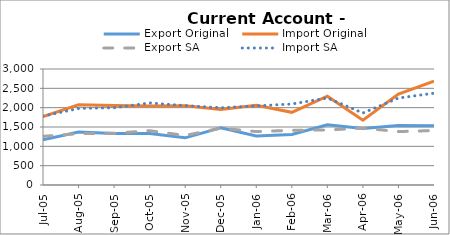
| Category | Export Original | Import Original | Export SA | Import SA |
|---|---|---|---|---|
| 2005-07-31 | 1171 | 1767 | 1259 | 1781 |
| 2005-08-31 | 1368 | 2074 | 1327 | 1980 |
| 2005-09-30 | 1331 | 2058 | 1338 | 1998 |
| 2005-10-31 | 1332 | 2045 | 1404 | 2122 |
| 2005-11-30 | 1220 | 2049 | 1281 | 2053 |
| 2005-12-31 | 1482 | 1951 | 1470 | 1998 |
| 2006-01-31 | 1269 | 2063 | 1381 | 2045 |
| 2006-02-28 | 1306 | 1879 | 1415 | 2095 |
| 2006-03-31 | 1555 | 2297 | 1422 | 2251 |
| 2006-04-30 | 1463 | 1674 | 1472 | 1862 |
| 2006-05-31 | 1540 | 2352 | 1381 | 2249 |
| 2006-06-30 | 1535 | 2684 | 1409 | 2374 |